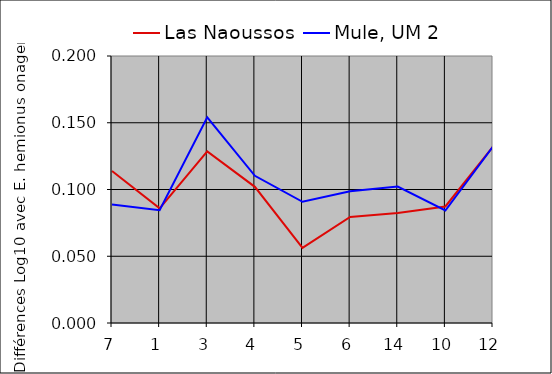
| Category | Las Naoussos | Mule, UM 2 |
|---|---|---|
| 7.0 | 0.114 | 0.089 |
| 1.0 | 0.086 | 0.084 |
| 3.0 | 0.129 | 0.154 |
| 4.0 | 0.102 | 0.11 |
| 5.0 | 0.056 | 0.091 |
| 6.0 | 0.079 | 0.099 |
| 14.0 | 0.082 | 0.102 |
| 10.0 | 0.087 | 0.084 |
| 12.0 | 0.132 | 0.132 |